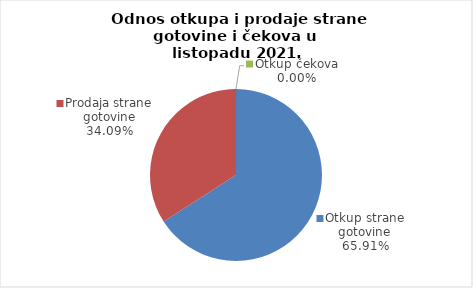
| Category | Series 0 |
|---|---|
| Otkup strane gotovine | 65.914 |
| Prodaja strane gotovine | 34.086 |
| Otkup čekova | 0 |